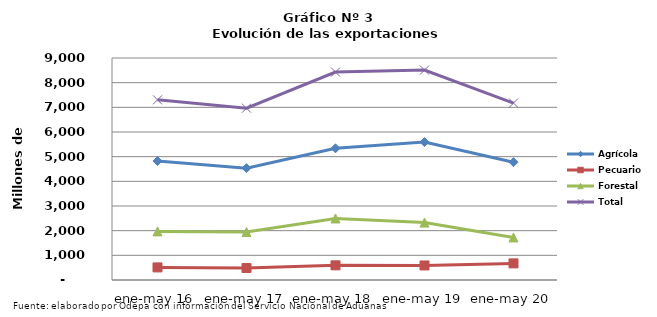
| Category | Agrícola | Pecuario | Forestal | Total |
|---|---|---|---|---|
| ene-may 16 | 4822122 | 510786 | 1971116 | 7304024 |
| ene-may 17 | 4533804 | 487220 | 1944844 | 6965868 |
| ene-may 18 | 5339884 | 594454 | 2494722 | 8429060 |
| ene-may 19 | 5591966 | 589627 | 2327787 | 8509380 |
| ene-may 20 | 4776619 | 673312 | 1723685 | 7173616 |